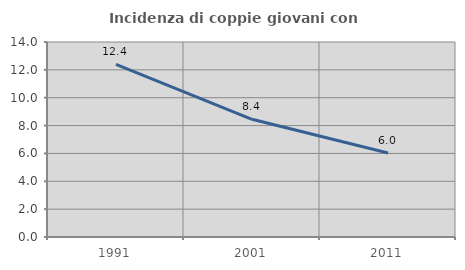
| Category | Incidenza di coppie giovani con figli |
|---|---|
| 1991.0 | 12.401 |
| 2001.0 | 8.448 |
| 2011.0 | 6.034 |